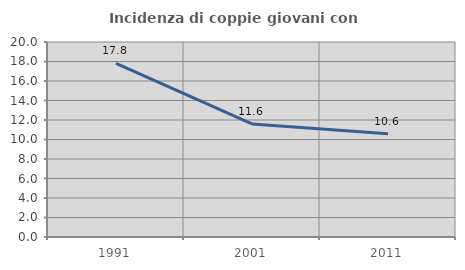
| Category | Incidenza di coppie giovani con figli |
|---|---|
| 1991.0 | 17.808 |
| 2001.0 | 11.594 |
| 2011.0 | 10.596 |